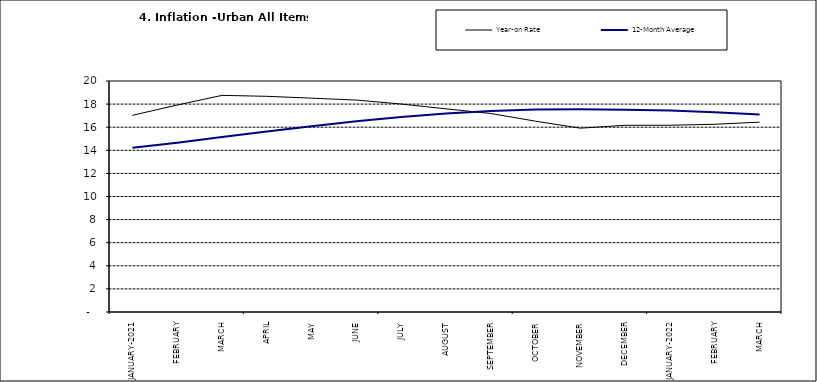
| Category | Year-on Rate | 12-Month Average |
|---|---|---|
| JANUARY-2021 | 17.03 | 14.228 |
| FEBRUARY | 17.918 | 14.66 |
| MARCH | 18.756 | 15.154 |
| APRIL | 18.675 | 15.63 |
| MAY | 18.514 | 16.086 |
| JUNE | 18.348 | 16.512 |
| JULY | 18.007 | 16.886 |
| AUGUST | 17.59 | 17.187 |
| SEPTEMBER | 17.187 | 17.411 |
| OCTOBER | 16.52 | 17.534 |
| NOVEMBER | 15.916 | 17.55 |
| DECEMBER | 16.165 | 17.519 |
| JANUARY-2022 | 16.171 | 17.435 |
| FEBRUARY | 16.253 | 17.292 |
| MARCH | 16.438 | 17.103 |